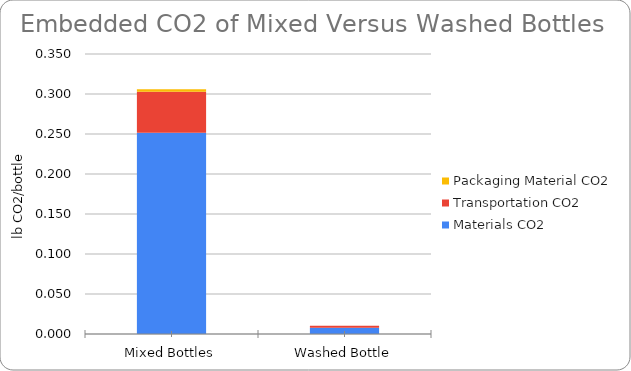
| Category | Materials CO2 | Transportation CO2 | Packaging Material CO2 |
|---|---|---|---|
| Mixed Bottles | 0.252 | 0.051 | 0.003 |
| Washed Bottle | 0.008 | 0.002 | 0 |